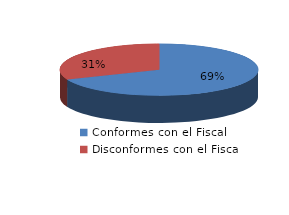
| Category | Series 0 |
|---|---|
| 0 | 2120 |
| 1 | 962 |